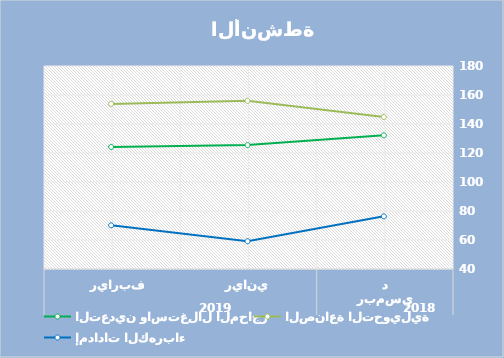
| Category | التعدين واستغلال المحاجر | الصناعة التحويلية | إمدادات الكهرباء |
|---|---|---|---|
| 0 | 132.18 | 144.85 | 76.31 |
| 1 | 125.45 | 155.98 | 59.15 |
| 2 | 124.14 | 153.87 | 70.1 |